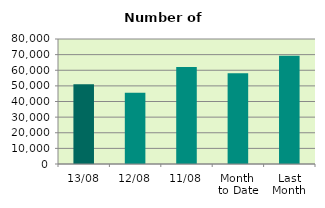
| Category | Series 0 |
|---|---|
| 13/08 | 51086 |
| 12/08 | 45588 |
| 11/08 | 62026 |
| Month 
to Date | 58067.8 |
| Last
Month | 69237.818 |